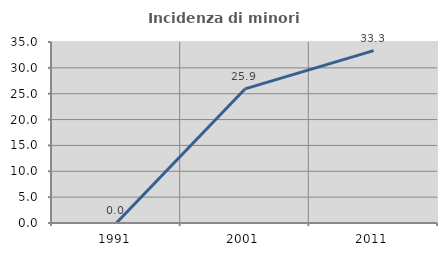
| Category | Incidenza di minori stranieri |
|---|---|
| 1991.0 | 0 |
| 2001.0 | 25.926 |
| 2011.0 | 33.333 |